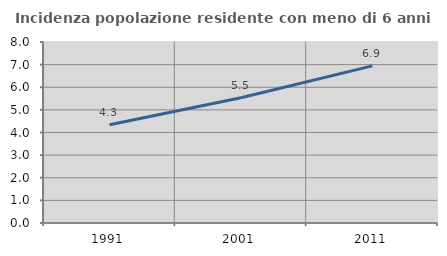
| Category | Incidenza popolazione residente con meno di 6 anni |
|---|---|
| 1991.0 | 4.34 |
| 2001.0 | 5.538 |
| 2011.0 | 6.945 |